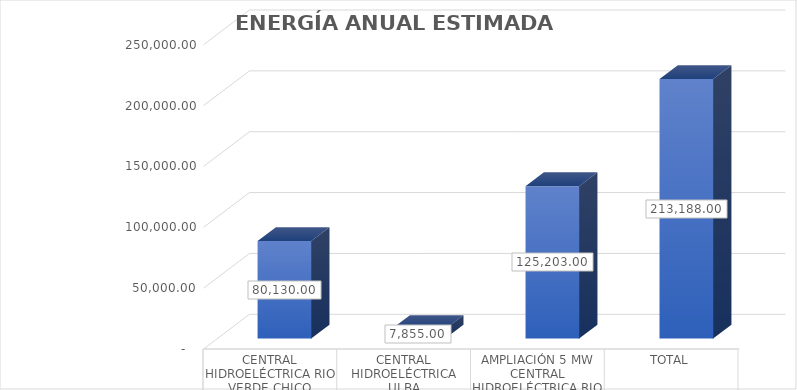
| Category | ENERGÍA ANUAL ESTIMADA [MWh] |
|---|---|
| CENTRAL HIDROELÉCTRICA RIO VERDE CHICO | 80130 |
| CENTRAL HIDROELÉCTRICA ULBA | 7855 |
| AMPLIACIÓN 5 MW CENTRAL HIDROELÉCTRICA RIO VERDE CHICO | 125203 |
| TOTAL | 213188 |